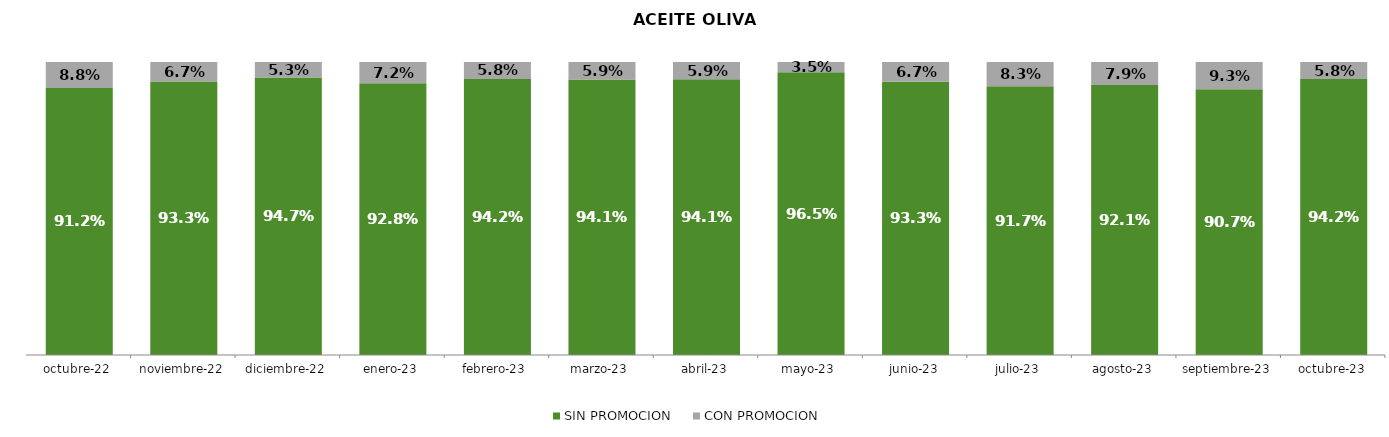
| Category | SIN PROMOCION   | CON PROMOCION   |
|---|---|---|
| 2022-10-01 | 0.912 | 0.088 |
| 2022-11-01 | 0.933 | 0.067 |
| 2022-12-01 | 0.947 | 0.053 |
| 2023-01-01 | 0.928 | 0.072 |
| 2023-02-01 | 0.942 | 0.058 |
| 2023-03-01 | 0.941 | 0.059 |
| 2023-04-01 | 0.941 | 0.059 |
| 2023-05-01 | 0.965 | 0.035 |
| 2023-06-01 | 0.933 | 0.067 |
| 2023-07-01 | 0.917 | 0.083 |
| 2023-08-01 | 0.921 | 0.079 |
| 2023-09-01 | 0.907 | 0.093 |
| 2023-10-01 | 0.942 | 0.058 |